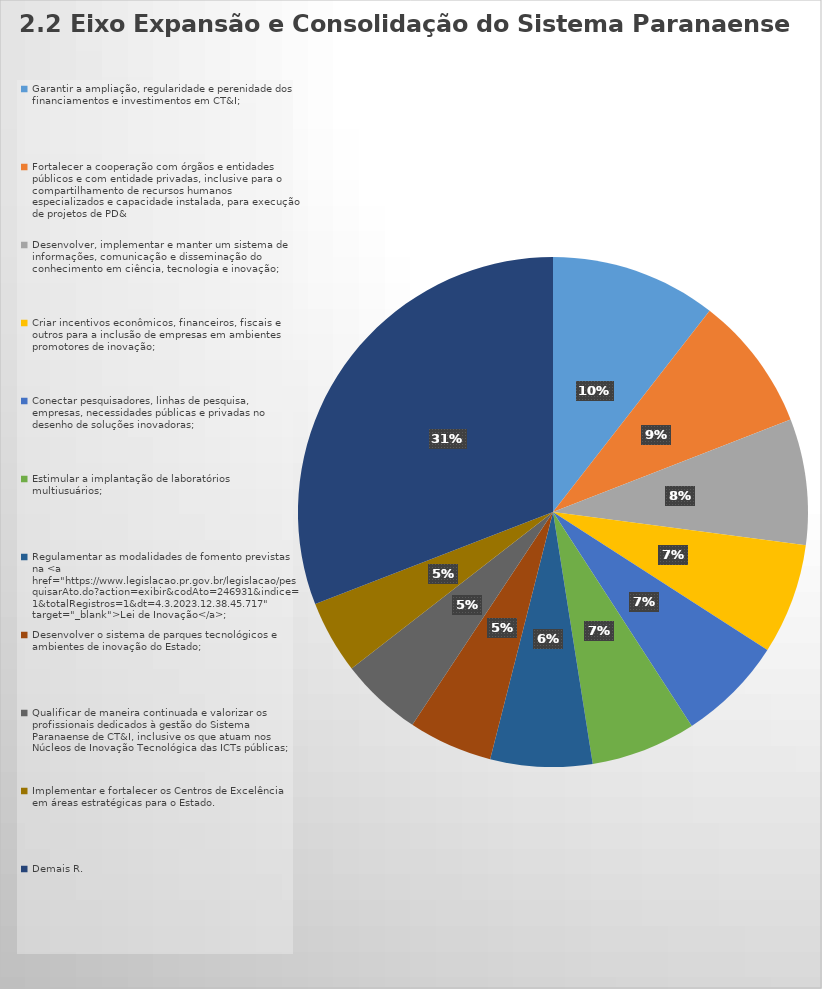
| Category | Series 0 |
|---|---|
| Garantir a ampliação, regularidade e perenidade dos financiamentos e investimentos em CT&I; | 150 |
| Fortalecer a cooperação com órgãos e entidades públicos e com entidade privadas, inclusive para o compartilhamento de recursos humanos especializados e capacidade instalada, para execução de projetos de PD& | 122 |
| Desenvolver, implementar e manter um sistema de informações, comunicação e disseminação do conhecimento em ciência, tecnologia e inovação; | 114 |
| Criar incentivos econômicos, financeiros, fiscais e outros para a inclusão de empresas em ambientes promotores de inovação; | 100 |
| Conectar pesquisadores, linhas de pesquisa, empresas, necessidades públicas e privadas no desenho de soluções inovadoras; | 96 |
| Estimular a implantação de laboratórios multiusuários; | 95 |
| Regulamentar as modalidades de fomento previstas na <a href="https://www.legislacao.pr.gov.br/legislacao/pesquisarAto.do?action=exibir&codAto=246931&indice=1&totalRegistros=1&dt=4.3.2023.12.38.45.717" target="_blank">Lei de Inovação</a>; | 92 |
| Desenvolver o sistema de parques tecnológicos e ambientes de inovação do Estado; | 76 |
| Qualificar de maneira continuada e valorizar os profissionais dedicados à gestão do Sistema Paranaense de CT&I, inclusive os que atuam nos Núcleos de Inovação Tecnológica das ICTs públicas; | 74 |
| Implementar e fortalecer os Centros de Excelência em áreas estratégicas para o Estado. | 66 |
| Demais R. | 440 |